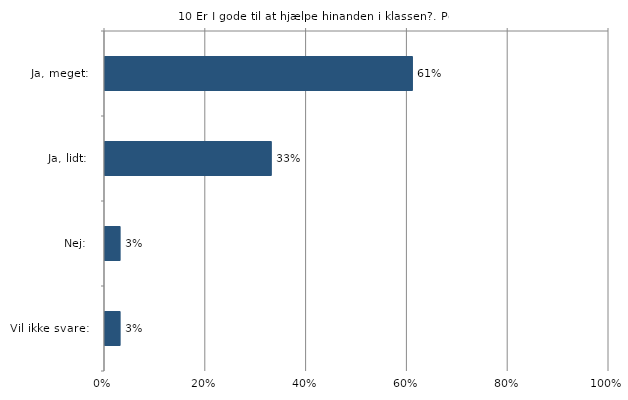
| Category | Er I gode til at hjælpe hinanden i klassen? |
|---|---|
| Ja, meget:   | 0.61 |
| Ja, lidt:   | 0.33 |
| Nej:   | 0.03 |
| Vil ikke svare:   | 0.03 |